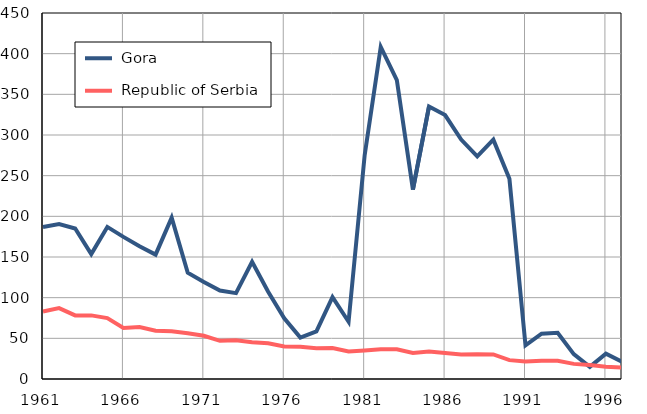
| Category |  Gora |  Republic of Serbia |
|---|---|---|
| 1961.0 | 186.9 | 82.9 |
| 1962.0 | 190.6 | 87.1 |
| 1963.0 | 185 | 78.2 |
| 1964.0 | 153.6 | 78.2 |
| 1965.0 | 187 | 74.9 |
| 1966.0 | 174.7 | 62.8 |
| 1967.0 | 163.1 | 63.8 |
| 1968.0 | 152.9 | 59.4 |
| 1969.0 | 198.3 | 58.7 |
| 1970.0 | 130.6 | 56.3 |
| 1971.0 | 119.3 | 53.1 |
| 1972.0 | 108.7 | 46.9 |
| 1973.0 | 105.6 | 47.7 |
| 1974.0 | 144.2 | 45.3 |
| 1975.0 | 107.3 | 44 |
| 1976.0 | 74.5 | 39.9 |
| 1977.0 | 51 | 39.6 |
| 1978.0 | 58.5 | 37.8 |
| 1979.0 | 100.7 | 38.2 |
| 1980.0 | 70.4 | 33.9 |
| 1981.0 | 275.2 | 35 |
| 1982.0 | 408.4 | 36.5 |
| 1983.0 | 367.6 | 36.6 |
| 1984.0 | 232.8 | 31.9 |
| 1985.0 | 335 | 33.7 |
| 1986.0 | 324.5 | 32 |
| 1987.0 | 294.4 | 30.2 |
| 1988.0 | 273.8 | 30.5 |
| 1989.0 | 294.3 | 30.2 |
| 1990.0 | 246.1 | 23.2 |
| 1991.0 | 41.3 | 21.6 |
| 1992.0 | 55.7 | 22.3 |
| 1993.0 | 56.9 | 22.3 |
| 1994.0 | 30.5 | 18.6 |
| 1995.0 | 14.9 | 17.2 |
| 1996.0 | 31.2 | 15.1 |
| 1997.0 | 21.3 | 14.2 |